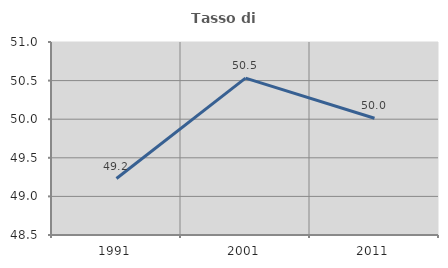
| Category | Tasso di occupazione   |
|---|---|
| 1991.0 | 49.232 |
| 2001.0 | 50.531 |
| 2011.0 | 50.012 |